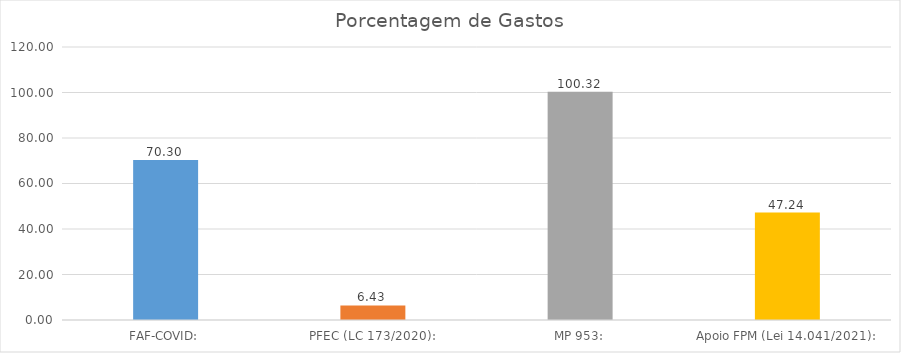
| Category | Series 0 |
|---|---|
| FAF-COVID: | 70.299 |
| PFEC (LC 173/2020): | 6.427 |
| MP 953: | 100.325 |
| Apoio FPM (Lei 14.041/2021): | 47.237 |